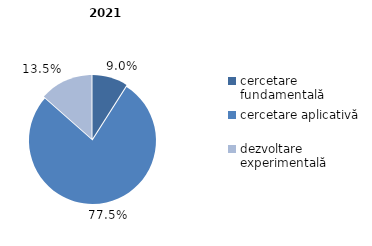
| Category | 2021 |
|---|---|
| cercetare fundamentală | 9 |
| cercetare aplicativă | 77.5 |
| dezvoltare experimentală | 13.5 |